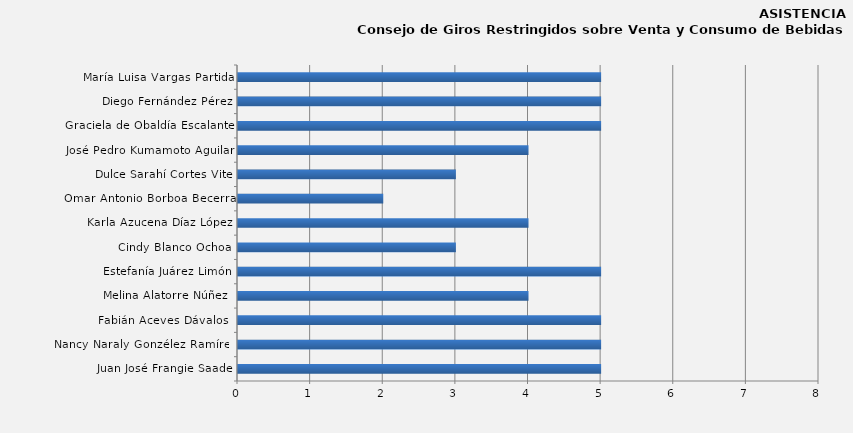
| Category | Series 0 |
|---|---|
| Juan José Frangie Saade | 5 |
| Nancy Naraly Gonzélez Ramírez | 5 |
| Fabián Aceves Dávalos  | 5 |
| Melina Alatorre Núñez  | 4 |
| Estefanía Juárez Limón | 5 |
| Cindy Blanco Ochoa | 3 |
| Karla Azucena Díaz López | 4 |
| Omar Antonio Borboa Becerra | 2 |
| Dulce Sarahí Cortes Vite | 3 |
| José Pedro Kumamoto Aguilar | 4 |
| Graciela de Obaldía Escalante | 5 |
| Diego Fernández Pérez | 5 |
| María Luisa Vargas Partida | 5 |